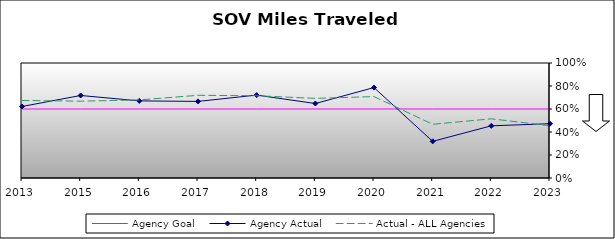
| Category | Agency Goal | Agency Actual | Actual - ALL Agencies |
|---|---|---|---|
| 2013.0 | 0.6 | 0.622 | 0.674 |
| 2015.0 | 0.6 | 0.718 | 0.668 |
| 2016.0 | 0.6 | 0.671 | 0.679 |
| 2017.0 | 0.6 | 0.666 | 0.719 |
| 2018.0 | 0.6 | 0.721 | 0.715 |
| 2019.0 | 0.6 | 0.648 | 0.692 |
| 2020.0 | 0.6 | 0.786 | 0.708 |
| 2021.0 | 0.6 | 0.319 | 0.467 |
| 2022.0 | 0.6 | 0.454 | 0.515 |
| 2023.0 | 0.6 | 0.472 | 0.454 |